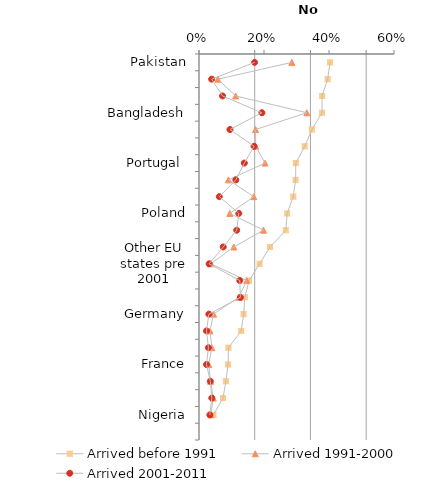
| Category | Series 0 |
|---|---|
| Pakistan | 0.471 |
| Italy | 0.462 |
| Ireland | 0.442 |
| Bangladesh | 0.442 |
| China | 0.405 |
| Jamaica | 0.38 |
| Portugal  | 0.348 |
| Other EU states post 2001 | 0.347 |
| India | 0.338 |
| Poland | 0.316 |
| Rest of Europe | 0.312 |
| Americas and Caribbean Other | 0.255 |
| Other EU states pre 2001 | 0.218 |
| Other Middle East and Asia  | 0.18 |
| Other Africa | 0.165 |
| Germany | 0.16 |
| Canada | 0.152 |
| Antarctica, Oceania and other | 0.106 |
| France | 0.104 |
| South Africa | 0.097 |
| United States | 0.086 |
| Nigeria | 0.052 |